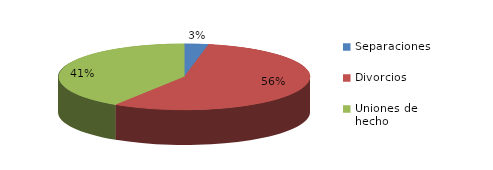
| Category | Series 0 |
|---|---|
| Separaciones | 16 |
| Divorcios | 289 |
| Uniones de hecho | 211 |